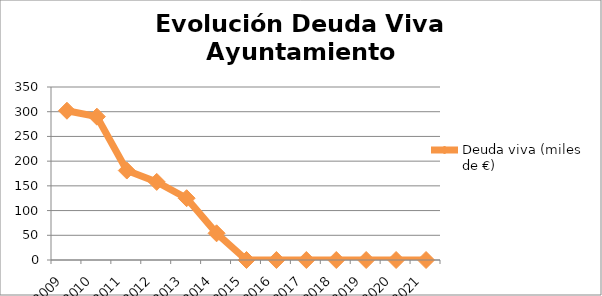
| Category | Deuda viva (miles de €) |
|---|---|
| 2009.0 | 302 |
| 2010.0 | 290 |
| 2011.0 | 181 |
| 2012.0 | 158 |
| 2013.0 | 125 |
| 2014.0 | 54 |
| 2015.0 | 0 |
| 2016.0 | 0 |
| 2017.0 | 0 |
| 2018.0 | 0 |
| 2019.0 | 0 |
| 2020.0 | 0 |
| 2021.0 | 0 |